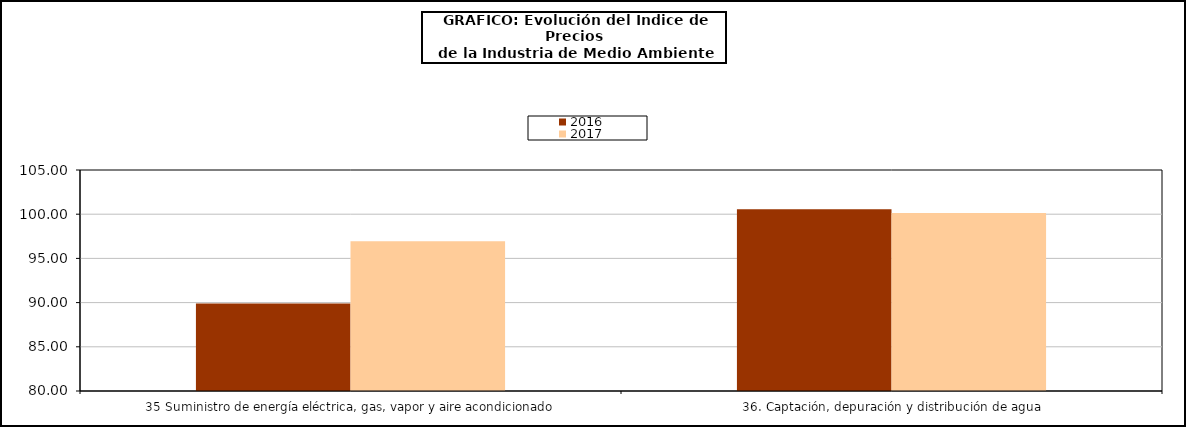
| Category | 2016 | 2017 |
|---|---|---|
| 35 Suministro de energía eléctrica, gas, vapor y aire acondicionado | 89.898 | 96.946 |
| 36. Captación, depuración y distribución de agua | 100.556 | 100.144 |